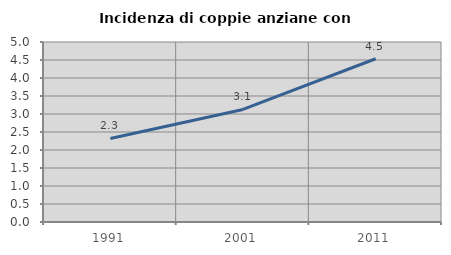
| Category | Incidenza di coppie anziane con figli |
|---|---|
| 1991.0 | 2.322 |
| 2001.0 | 3.127 |
| 2011.0 | 4.534 |